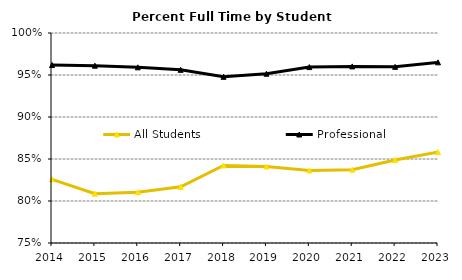
| Category | All Students | Professional |
|---|---|---|
| 2014.0 | 0.826 | 0.962 |
| 2015.0 | 0.809 | 0.961 |
| 2016.0 | 0.811 | 0.959 |
| 2017.0 | 0.817 | 0.956 |
| 2018.0 | 0.842 | 0.948 |
| 2019.0 | 0.841 | 0.952 |
| 2020.0 | 0.836 | 0.959 |
| 2021.0 | 0.837 | 0.96 |
| 2022.0 | 0.849 | 0.96 |
| 2023.0 | 0.858 | 0.965 |